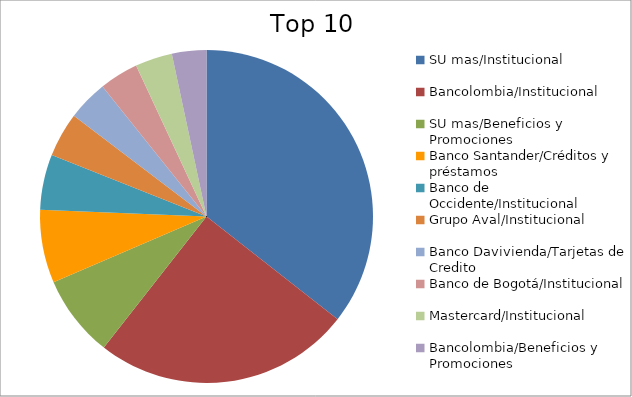
| Category | Series 0 |
|---|---|
| SU mas/Institucional | 28.72 |
| Bancolombia/Institucional | 20.18 |
| SU mas/Beneficios y Promociones | 6.43 |
| Banco Santander/Créditos y préstamos | 5.73 |
| Banco de Occidente/Institucional | 4.34 |
| Grupo Aval/Institucional | 3.49 |
| Banco Davivienda/Tarjetas de Credito | 3.17 |
| Banco de Bogotá/Institucional | 3.06 |
| Mastercard/Institucional | 2.91 |
| Bancolombia/Beneficios y Promociones | 2.7 |